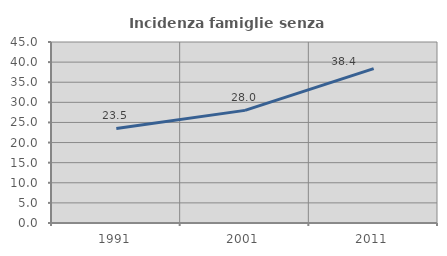
| Category | Incidenza famiglie senza nuclei |
|---|---|
| 1991.0 | 23.497 |
| 2001.0 | 27.997 |
| 2011.0 | 38.38 |